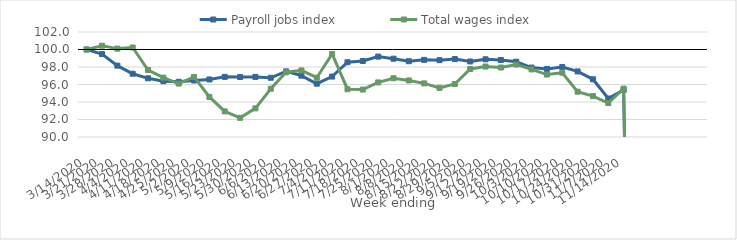
| Category | Payroll jobs index | Total wages index |
|---|---|---|
| 14/03/2020 | 100 | 100 |
| 21/03/2020 | 99.474 | 100.43 |
| 28/03/2020 | 98.157 | 100.102 |
| 04/04/2020 | 97.23 | 100.226 |
| 11/04/2020 | 96.706 | 97.66 |
| 18/04/2020 | 96.379 | 96.779 |
| 25/04/2020 | 96.31 | 96.104 |
| 02/05/2020 | 96.459 | 96.869 |
| 09/05/2020 | 96.575 | 94.576 |
| 16/05/2020 | 96.873 | 92.926 |
| 23/05/2020 | 96.858 | 92.192 |
| 30/05/2020 | 96.869 | 93.271 |
| 06/06/2020 | 96.77 | 95.514 |
| 13/06/2020 | 97.499 | 97.396 |
| 20/06/2020 | 97.01 | 97.612 |
| 27/06/2020 | 96.091 | 96.777 |
| 04/07/2020 | 96.905 | 99.487 |
| 11/07/2020 | 98.541 | 95.46 |
| 18/07/2020 | 98.69 | 95.421 |
| 25/07/2020 | 99.19 | 96.238 |
| 01/08/2020 | 98.947 | 96.716 |
| 08/08/2020 | 98.662 | 96.464 |
| 15/08/2020 | 98.815 | 96.126 |
| 22/08/2020 | 98.781 | 95.613 |
| 29/08/2020 | 98.901 | 96.06 |
| 05/09/2020 | 98.631 | 97.769 |
| 12/09/2020 | 98.88 | 98.05 |
| 19/09/2020 | 98.797 | 97.941 |
| 26/09/2020 | 98.6 | 98.281 |
| 03/10/2020 | 97.931 | 97.726 |
| 10/10/2020 | 97.778 | 97.135 |
| 17/10/2020 | 98.003 | 97.345 |
| 24/10/2020 | 97.493 | 95.178 |
| 31/10/2020 | 96.594 | 94.673 |
| 07/11/2020 | 94.395 | 93.882 |
| 14/11/2020 | 95.391 | 95.523 |